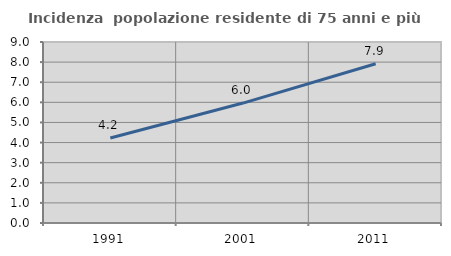
| Category | Incidenza  popolazione residente di 75 anni e più |
|---|---|
| 1991.0 | 4.225 |
| 2001.0 | 5.964 |
| 2011.0 | 7.916 |